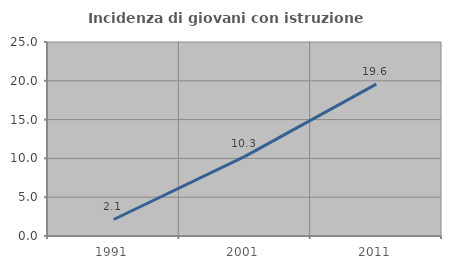
| Category | Incidenza di giovani con istruzione universitaria |
|---|---|
| 1991.0 | 2.128 |
| 2001.0 | 10.256 |
| 2011.0 | 19.565 |